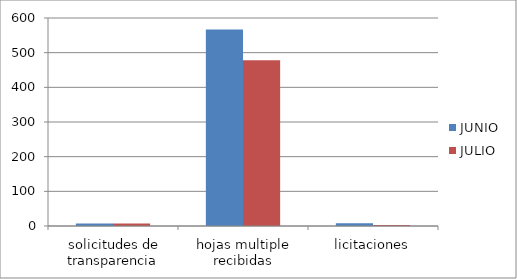
| Category | JUNIO | JULIO |
|---|---|---|
| solicitudes de transparencia | 7 | 7 |
| hojas multiple recibidas | 567 | 478 |
| licitaciones | 8 | 3 |